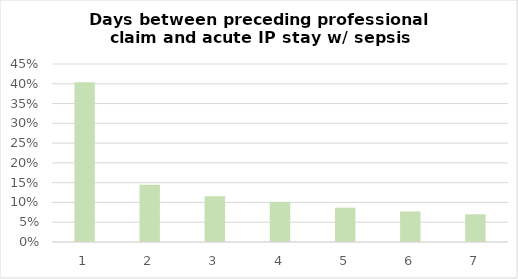
| Category | Number of days between preceeding professional claim and Acute IP admission |
|---|---|
| 1.0 | 0.404 |
| 2.0 | 0.145 |
| 3.0 | 0.116 |
| 4.0 | 0.101 |
| 5.0 | 0.087 |
| 6.0 | 0.077 |
| 7.0 | 0.07 |